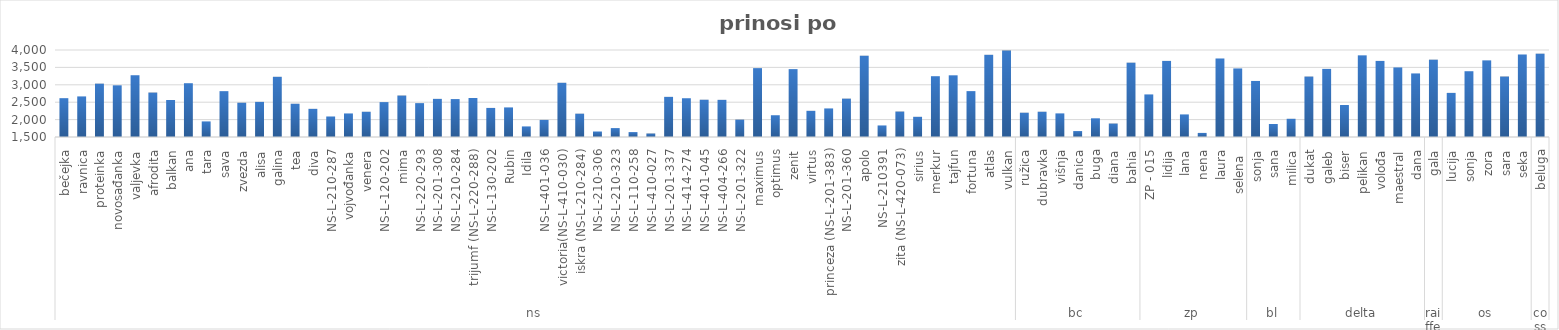
| Category | Series 0 |
|---|---|
| 0 | 2615.836 |
| 1 | 2666.375 |
| 2 | 3033 |
| 3 | 2985 |
| 4 | 3274.849 |
| 5 | 2776.475 |
| 6 | 2563.597 |
| 7 | 3045.533 |
| 8 | 1948.067 |
| 9 | 2817.53 |
| 10 | 2484.667 |
| 11 | 2509.4 |
| 12 | 3229.785 |
| 13 | 2455.667 |
| 14 | 2309.083 |
| 15 | 2089.7 |
| 16 | 2176.988 |
| 17 | 2225.3 |
| 18 | 2502.95 |
| 19 | 2690.633 |
| 20 | 2473.5 |
| 21 | 2595.6 |
| 22 | 2589.7 |
| 23 | 2621.567 |
| 24 | 2335.5 |
| 25 | 2350.175 |
| 26 | 1804.226 |
| 27 | 1991 |
| 28 | 3057.953 |
| 29 | 2169.867 |
| 30 | 1658 |
| 31 | 1756 |
| 32 | 1641 |
| 33 | 1600 |
| 34 | 2653.291 |
| 35 | 2613.821 |
| 36 | 2570.741 |
| 37 | 2567.559 |
| 38 | 1999.275 |
| 39 | 3479.089 |
| 40 | 2125.5 |
| 41 | 3450.5 |
| 42 | 2252 |
| 43 | 2321 |
| 44 | 2602 |
| 45 | 3835.293 |
| 46 | 1832 |
| 47 | 2231 |
| 48 | 2080 |
| 49 | 3246.954 |
| 50 | 3272.827 |
| 51 | 2818.667 |
| 52 | 3861.944 |
| 53 | 3982.56 |
| 54 | 2197.71 |
| 55 | 2225.87 |
| 56 | 2178.6 |
| 57 | 1670.31 |
| 58 | 2037.4 |
| 59 | 1886.2 |
| 60 | 3635.5 |
| 61 | 2723.6 |
| 62 | 3686.6 |
| 63 | 2149.1 |
| 64 | 1617.2 |
| 65 | 3756.5 |
| 66 | 3470.187 |
| 67 | 3110.646 |
| 68 | 1874.34 |
| 69 | 2022.993 |
| 70 | 3236.211 |
| 71 | 3457.004 |
| 72 | 2419 |
| 73 | 3846.482 |
| 74 | 3686.178 |
| 75 | 3499 |
| 76 | 3327 |
| 77 | 3721.681 |
| 78 | 2767.495 |
| 79 | 3390.209 |
| 80 | 3702.12 |
| 81 | 3237.52 |
| 82 | 3871.236 |
| 83 | 3894.163 |